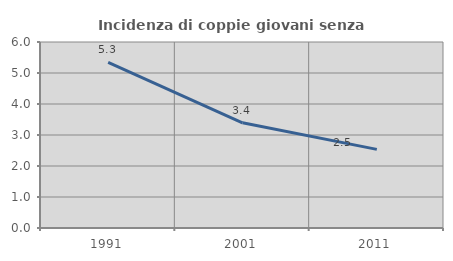
| Category | Incidenza di coppie giovani senza figli |
|---|---|
| 1991.0 | 5.345 |
| 2001.0 | 3.393 |
| 2011.0 | 2.537 |